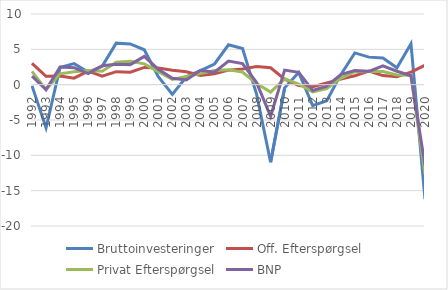
| Category | Bruttoinvesteringer | Off. Efterspørgsel | Privat Efterspørgsel | BNP |
|---|---|---|---|---|
| 1992 | -0.172 | 3.029 | 1.875 | 1.2 |
| 1993 | -6.101 | 1.189 | -0.701 | -0.693 |
| 1994 | 2.45 | 1.228 | 1.538 | 2.49 |
| 1995 | 2.971 | 0.922 | 1.812 | 2.403 |
| 1996 | 1.79 | 1.927 | 1.989 | 1.575 |
| 1997 | 2.6 | 1.199 | 1.904 | 2.681 |
| 1998 | 5.878 | 1.837 | 3.173 | 2.882 |
| 1999 | 5.769 | 1.764 | 3.303 | 2.836 |
| 2000 | 4.935 | 2.438 | 2.949 | 3.99 |
| 2001 | 1.117 | 2.363 | 1.847 | 2.176 |
| 2002 | -1.383 | 2.052 | 0.731 | 0.902 |
| 2003 | 1.107 | 1.831 | 1.148 | 0.659 |
| 2004 | 1.974 | 1.298 | 1.565 | 2.039 |
| 2005 | 2.923 | 1.558 | 2.01 | 1.755 |
| 2006 | 5.646 | 2.056 | 2.117 | 3.335 |
| 2007 | 5.127 | 2.232 | 1.776 | 2.979 |
| 2008 | -1.347 | 2.562 | 0.165 | 0.293 |
| 2009 | -10.974 | 2.384 | -1.048 | -4.475 |
| 2010 | -0.452 | 0.768 | 0.824 | 2.061 |
| 2011 | 1.737 | -0.119 | 0.093 | 1.74 |
| 2012 | -2.972 | -0.291 | -1.041 | -0.826 |
| 2013 | -2.279 | 0.238 | -0.561 | -0.202 |
| 2014 | 1.416 | 0.783 | 0.902 | 1.422 |
| 2015 | 4.496 | 1.267 | 1.83 | 1.988 |
| 2016 | 3.896 | 1.917 | 1.878 | 1.883 |
| 2017 | 3.776 | 1.283 | 1.849 | 2.677 |
| 2018 | 2.386 | 1.136 | 1.367 | 1.901 |
| 2019 | 5.798 | 1.766 | 1.329 | 1.269 |
| 2020 | -16.213 | 2.745 | -12.707 | -11.459 |